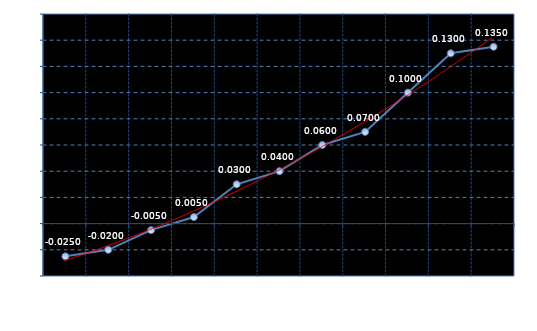
| Category | Series 0 |
|---|---|
| QSAS3U6 | -0.025 |
| QSAS6U6 | -0.02 |
| QSAS9U6 | -0.005 |
| QSAS12U6 | 0.005 |
| QSAS15U6 | 0.03 |
| QSAS18U6 | 0.04 |
| QSAS21U6 | 0.06 |
| QSAS24U6 | 0.07 |
| QSAS27U6 | 0.1 |
| QSAS30U6 | 0.13 |
| QSAS33U6 | 0.135 |